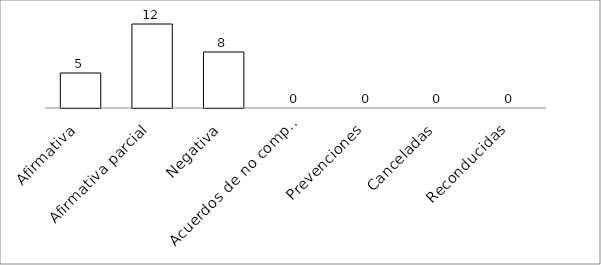
| Category | Series 0 |
|---|---|
| Afirmativa | 5 |
| Afirmativa parcial | 12 |
| Negativa | 8 |
| Acuerdos de no competencia | 0 |
| Prevenciones | 0 |
| Canceladas | 0 |
| Reconducidas | 0 |